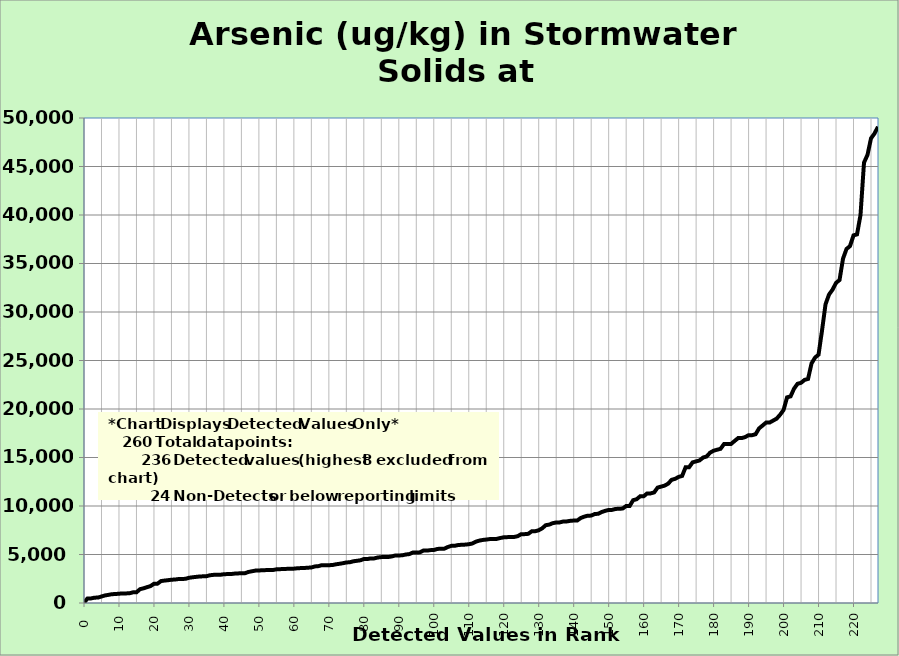
| Category | All Data |
|---|---|
| 0.0 | 32.1 |
| 1.0 | 470 |
| 2.0 | 470 |
| 3.0 | 550 |
| 4.0 | 560 |
| 5.0 | 670 |
| 6.0 | 780 |
| 7.0 | 840 |
| 8.0 | 910 |
| 9.0 | 922 |
| 10.0 | 960 |
| 11.0 | 980 |
| 12.0 | 990 |
| 13.0 | 1000 |
| 14.0 | 1100 |
| 15.0 | 1100 |
| 16.0 | 1420 |
| 17.0 | 1510 |
| 18.0 | 1630 |
| 19.0 | 1740 |
| 20.0 | 1980 |
| 21.0 | 1990 |
| 22.0 | 2260 |
| 23.0 | 2310 |
| 24.0 | 2350 |
| 25.0 | 2400 |
| 26.0 | 2420 |
| 27.0 | 2470 |
| 28.0 | 2480 |
| 29.0 | 2490 |
| 30.0 | 2600 |
| 31.0 | 2650 |
| 32.0 | 2690 |
| 33.0 | 2730 |
| 34.0 | 2750 |
| 35.0 | 2760 |
| 36.0 | 2860 |
| 37.0 | 2900 |
| 38.0 | 2900 |
| 39.0 | 2910 |
| 40.0 | 2970 |
| 41.0 | 2980 |
| 42.0 | 2980 |
| 43.0 | 3030 |
| 44.0 | 3050 |
| 45.0 | 3070 |
| 46.0 | 3070 |
| 47.0 | 3200 |
| 48.0 | 3270 |
| 49.0 | 3340 |
| 50.0 | 3350 |
| 51.0 | 3380 |
| 52.0 | 3390 |
| 53.0 | 3400 |
| 54.0 | 3400 |
| 55.0 | 3470 |
| 56.0 | 3490 |
| 57.0 | 3500 |
| 58.0 | 3520 |
| 59.0 | 3530 |
| 60.0 | 3540 |
| 61.0 | 3580 |
| 62.0 | 3600 |
| 63.0 | 3610 |
| 64.0 | 3640 |
| 65.0 | 3660 |
| 66.0 | 3770 |
| 67.0 | 3800 |
| 68.0 | 3900 |
| 69.0 | 3900 |
| 70.0 | 3900 |
| 71.0 | 3910 |
| 72.0 | 3990 |
| 73.0 | 4040 |
| 74.0 | 4100 |
| 75.0 | 4180 |
| 76.0 | 4200 |
| 77.0 | 4300 |
| 78.0 | 4350 |
| 79.0 | 4400 |
| 80.0 | 4530 |
| 81.0 | 4530 |
| 82.0 | 4600 |
| 83.0 | 4600 |
| 84.0 | 4690 |
| 85.0 | 4730 |
| 86.0 | 4730 |
| 87.0 | 4740 |
| 88.0 | 4800 |
| 89.0 | 4900 |
| 90.0 | 4900 |
| 91.0 | 4920 |
| 92.0 | 5000 |
| 93.0 | 5040 |
| 94.0 | 5200 |
| 95.0 | 5210 |
| 96.0 | 5220 |
| 97.0 | 5400 |
| 98.0 | 5400 |
| 99.0 | 5450 |
| 100.0 | 5460 |
| 101.0 | 5570 |
| 102.0 | 5600 |
| 103.0 | 5600 |
| 104.0 | 5770 |
| 105.0 | 5890 |
| 106.0 | 5900 |
| 107.0 | 5980 |
| 108.0 | 6000 |
| 109.0 | 6020 |
| 110.0 | 6060 |
| 111.0 | 6130 |
| 112.0 | 6320 |
| 113.0 | 6430 |
| 114.0 | 6500 |
| 115.0 | 6540 |
| 116.0 | 6590 |
| 117.0 | 6600 |
| 118.0 | 6610 |
| 119.0 | 6700 |
| 120.0 | 6770 |
| 121.0 | 6790 |
| 122.0 | 6800 |
| 123.0 | 6810 |
| 124.0 | 6890 |
| 125.0 | 7100 |
| 126.0 | 7100 |
| 127.0 | 7130 |
| 128.0 | 7390 |
| 129.0 | 7400 |
| 130.0 | 7500 |
| 131.0 | 7700 |
| 132.0 | 8020 |
| 133.0 | 8080 |
| 134.0 | 8230 |
| 135.0 | 8300 |
| 136.0 | 8310 |
| 137.0 | 8400 |
| 138.0 | 8410 |
| 139.0 | 8470 |
| 140.0 | 8500 |
| 141.0 | 8500 |
| 142.0 | 8760 |
| 143.0 | 8900 |
| 144.0 | 9000 |
| 145.0 | 9010 |
| 146.0 | 9170 |
| 147.0 | 9200 |
| 148.0 | 9380 |
| 149.0 | 9500 |
| 150.0 | 9590 |
| 151.0 | 9600 |
| 152.0 | 9700 |
| 153.0 | 9710 |
| 154.0 | 9740 |
| 155.0 | 10000 |
| 156.0 | 10000 |
| 157.0 | 10600 |
| 158.0 | 10700 |
| 159.0 | 11000 |
| 160.0 | 11000 |
| 161.0 | 11300 |
| 162.0 | 11300 |
| 163.0 | 11400 |
| 164.0 | 11900 |
| 165.0 | 12000 |
| 166.0 | 12100 |
| 167.0 | 12300 |
| 168.0 | 12700 |
| 169.0 | 12800 |
| 170.0 | 13000 |
| 171.0 | 13100 |
| 172.0 | 14000 |
| 173.0 | 14000 |
| 174.0 | 14500 |
| 175.0 | 14600 |
| 176.0 | 14700 |
| 177.0 | 15000 |
| 178.0 | 15100 |
| 179.0 | 15500 |
| 180.0 | 15700 |
| 181.0 | 15800 |
| 182.0 | 15900 |
| 183.0 | 16400 |
| 184.0 | 16400 |
| 185.0 | 16400 |
| 186.0 | 16700 |
| 187.0 | 17000 |
| 188.0 | 17000 |
| 189.0 | 17100 |
| 190.0 | 17300 |
| 191.0 | 17300 |
| 192.0 | 17400 |
| 193.0 | 18000 |
| 194.0 | 18300 |
| 195.0 | 18600 |
| 196.0 | 18600 |
| 197.0 | 18800 |
| 198.0 | 19000 |
| 199.0 | 19400 |
| 200.0 | 19900 |
| 201.0 | 21200 |
| 202.0 | 21300 |
| 203.0 | 22100 |
| 204.0 | 22600 |
| 205.0 | 22700 |
| 206.0 | 23000 |
| 207.0 | 23100 |
| 208.0 | 24700 |
| 209.0 | 25300 |
| 210.0 | 25600 |
| 211.0 | 28100 |
| 212.0 | 30800 |
| 213.0 | 31800 |
| 214.0 | 32300 |
| 215.0 | 33000 |
| 216.0 | 33300 |
| 217.0 | 35500 |
| 218.0 | 36500 |
| 219.0 | 36800 |
| 220.0 | 37900 |
| 221.0 | 38000 |
| 222.0 | 40000 |
| 223.0 | 45400 |
| 224.0 | 46200 |
| 225.0 | 47900 |
| 226.0 | 48400 |
| 227.0 | 49100 |